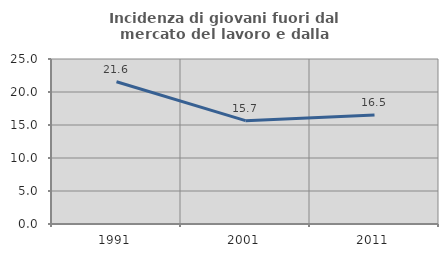
| Category | Incidenza di giovani fuori dal mercato del lavoro e dalla formazione  |
|---|---|
| 1991.0 | 21.551 |
| 2001.0 | 15.655 |
| 2011.0 | 16.529 |